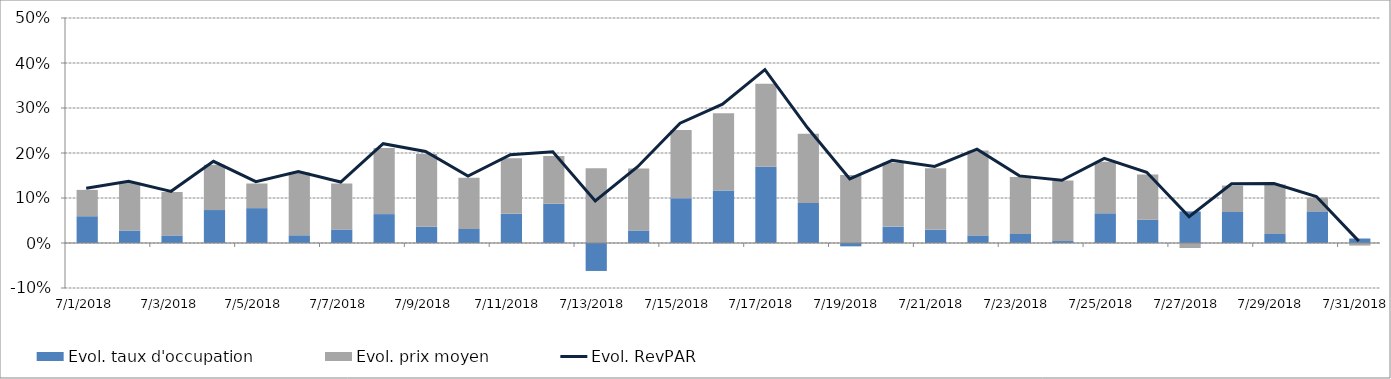
| Category | Evol. taux d'occupation | Evol. prix moyen |
|---|---|---|
| 7/1/18 | 0.059 | 0.059 |
| 7/2/18 | 0.028 | 0.106 |
| 7/3/18 | 0.017 | 0.096 |
| 7/4/18 | 0.073 | 0.101 |
| 7/5/18 | 0.077 | 0.055 |
| 7/6/18 | 0.017 | 0.139 |
| 7/7/18 | 0.03 | 0.102 |
| 7/8/18 | 0.064 | 0.147 |
| 7/9/18 | 0.036 | 0.162 |
| 7/10/18 | 0.031 | 0.114 |
| 7/11/18 | 0.065 | 0.123 |
| 7/12/18 | 0.087 | 0.106 |
| 7/13/18 | -0.062 | 0.166 |
| 7/14/18 | 0.028 | 0.138 |
| 7/15/18 | 0.1 | 0.152 |
| 7/16/18 | 0.117 | 0.172 |
| 7/17/18 | 0.169 | 0.185 |
| 7/18/18 | 0.089 | 0.154 |
| 7/19/18 | -0.007 | 0.151 |
| 7/20/18 | 0.036 | 0.142 |
| 7/21/18 | 0.029 | 0.137 |
| 7/22/18 | 0.017 | 0.188 |
| 7/23/18 | 0.02 | 0.126 |
| 7/24/18 | 0.004 | 0.134 |
| 7/25/18 | 0.066 | 0.114 |
| 7/26/18 | 0.052 | 0.1 |
| 7/27/18 | 0.07 | -0.011 |
| 7/28/18 | 0.069 | 0.059 |
| 7/29/18 | 0.02 | 0.11 |
| 7/30/18 | 0.07 | 0.031 |
| 7/31/18 | 0.01 | -0.006 |